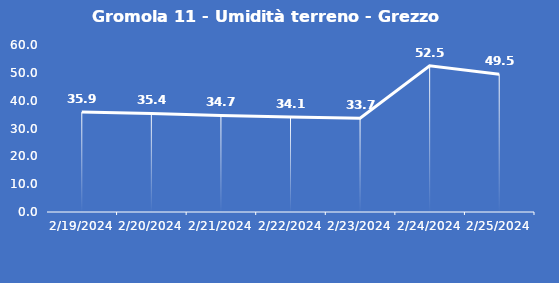
| Category | Gromola 11 - Umidità terreno - Grezzo (%VWC) |
|---|---|
| 2/19/24 | 35.9 |
| 2/20/24 | 35.4 |
| 2/21/24 | 34.7 |
| 2/22/24 | 34.1 |
| 2/23/24 | 33.7 |
| 2/24/24 | 52.5 |
| 2/25/24 | 49.5 |